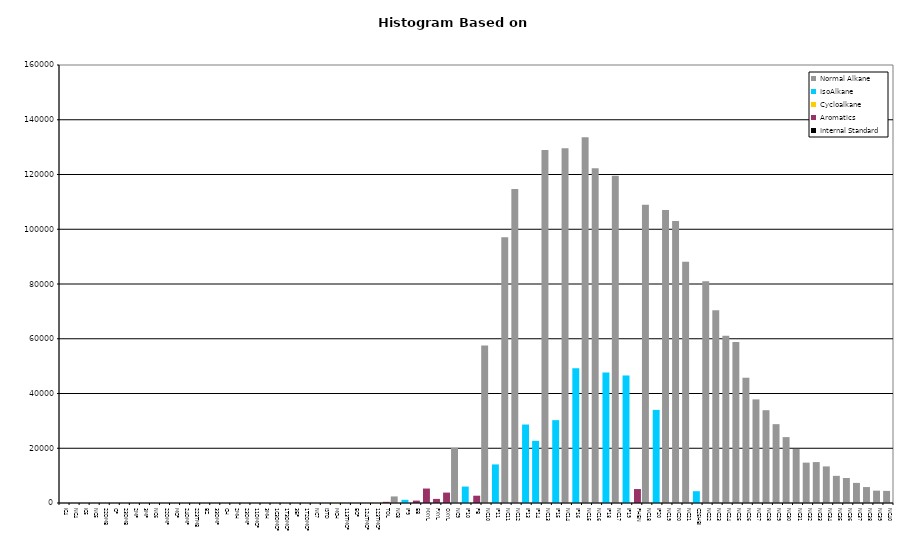
| Category | Normal Alkane | IsoAlkane | Cycloalkane | Aromatics | Internal Standard |
|---|---|---|---|---|---|
| IC4 | 0 | 0 | 0 | 0 | 0 |
| NC4 | 0 | 0 | 0 | 0 | 0 |
| IC5 | 0 | 0 | 0 | 0 | 0 |
| NC5 | 0 | 0 | 0 | 0 | 0 |
| 22DMB | 0 | 0 | 0 | 0 | 0 |
| CP | 0 | 0 | 0 | 0 | 0 |
| 23DMB | 0 | 0 | 0 | 0 | 0 |
| 2MP | 0 | 0 | 0 | 0 | 0 |
| 3MP | 0 | 0 | 0 | 0 | 0 |
| NC6 | 0 | 0 | 0 | 0 | 0 |
| 22DMP | 0 | 0 | 0 | 0 | 0 |
| MCP | 0 | 0 | 0 | 0 | 0 |
| 24DMP | 0 | 0 | 0 | 0 | 0 |
| 223TMB | 0 | 0 | 0 | 0 | 0 |
| BZ | 0 | 0 | 0 | 0 | 0 |
| 33DMP | 0 | 0 | 0 | 0 | 0 |
| CH | 0 | 0 | 0 | 0 | 0 |
| 2MH | 0 | 0 | 0 | 0 | 0 |
| 23DMP | 0 | 0 | 0 | 0 | 0 |
| 11DMCP | 0 | 0 | 0 | 0 | 0 |
| 3MH | 0 | 0 | 0 | 0 | 0 |
| 1C3DMCP | 0 | 0 | 0 | 0 | 0 |
| 1T3DMCP | 0 | 0 | 0 | 0 | 0 |
| 3EP | 0 | 0 | 0 | 0 | 0 |
| 1T2DMCP | 0 | 0 | 0 | 0 | 0 |
| NC7 | 0 | 0 | 0 | 0 | 0 |
| ISTD | 0 | 0 | 0 | 0 | 0 |
| MCH | 0 | 0 | 133 | 0 | 0 |
| 113TMCP | 0 | 0 | 0 | 0 | 0 |
| ECP | 0 | 0 | 0 | 0 | 0 |
| 124TMCP | 0 | 0 | 33 | 0 | 0 |
| 123TMCP | 0 | 0 | 55 | 0 | 0 |
| TOL | 0 | 0 | 0 | 424 | 0 |
| NC8 | 2402 | 0 | 0 | 0 | 0 |
| IP9 | 0 | 1168 | 0 | 0 | 0 |
| EB | 0 | 0 | 0 | 872 | 0 |
| MXYL | 0 | 0 | 0 | 5284 | 0 |
| PXYL | 0 | 0 | 0 | 1493 | 0 |
| OXYL | 0 | 0 | 0 | 3802 | 0 |
| NC9 | 20152 | 0 | 0 | 0 | 0 |
| IP10 | 0 | 6008 | 0 | 0 | 0 |
| PB | 0 | 0 | 0 | 2663 | 0 |
| NC10 | 57549 | 0 | 0 | 0 | 0 |
| IP11 | 0 | 14089 | 0 | 0 | 0 |
| NC11 | 97092 | 0 | 0 | 0 | 0 |
| NC12 | 114675 | 0 | 0 | 0 | 0 |
| IP13 | 0 | 28663 | 0 | 0 | 0 |
| IP14 | 0 | 22714 | 0 | 0 | 0 |
| NC13 | 128965 | 0 | 0 | 0 | 0 |
| IP15 | 0 | 30265 | 0 | 0 | 0 |
| NC14 | 129600 | 0 | 0 | 0 | 0 |
| IP16 | 0 | 49259 | 0 | 0 | 0 |
| NC15 | 133652 | 0 | 0 | 0 | 0 |
| NC16 | 122288 | 0 | 0 | 0 | 0 |
| IP18 | 0 | 47703 | 0 | 0 | 0 |
| NC17 | 119523 | 0 | 0 | 0 | 0 |
| IP19 | 0 | 46588 | 0 | 0 | 0 |
| PHEN | 0 | 0 | 0 | 5096 | 0 |
| NC18 | 108985 | 0 | 0 | 0 | 0 |
| IP20 | 0 | 34010 | 0 | 0 | 0 |
| NC19 | 107077 | 0 | 0 | 0 | 0 |
| NC20 | 103045 | 0 | 0 | 0 | 0 |
| NC21 | 88171 | 0 | 0 | 0 | 0 |
| C25HBI | 0 | 4310 | 0 | 0 | 0 |
| NC22 | 80966 | 0 | 0 | 0 | 0 |
| NC23 | 70433 | 0 | 0 | 0 | 0 |
| NC24 | 61120 | 0 | 0 | 0 | 0 |
| NC25 | 58809 | 0 | 0 | 0 | 0 |
| NC26 | 45757 | 0 | 0 | 0 | 0 |
| NC27 | 37852 | 0 | 0 | 0 | 0 |
| NC28 | 33899 | 0 | 0 | 0 | 0 |
| NC29 | 28801 | 0 | 0 | 0 | 0 |
| NC30 | 24071 | 0 | 0 | 0 | 0 |
| NC31 | 19746 | 0 | 0 | 0 | 0 |
| NC32 | 14749 | 0 | 0 | 0 | 0 |
| NC33 | 14946 | 0 | 0 | 0 | 0 |
| NC34 | 13369 | 0 | 0 | 0 | 0 |
| NC35 | 9919 | 0 | 0 | 0 | 0 |
| NC36 | 9139 | 0 | 0 | 0 | 0 |
| NC37 | 7342 | 0 | 0 | 0 | 0 |
| NC38 | 5827 | 0 | 0 | 0 | 0 |
| NC39 | 4514 | 0 | 0 | 0 | 0 |
| NC40 | 4423 | 0 | 0 | 0 | 0 |